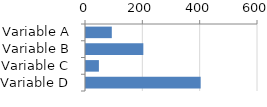
| Category | Series 0 |
|---|---|
| Variable A | 90 |
| Variable B | 200 |
| Variable C | 45 |
| Variable D | 400 |